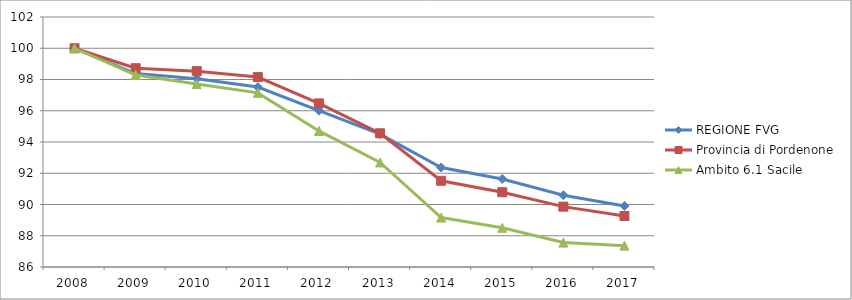
| Category | REGIONE FVG | Provincia di Pordenone | Ambito 6.1 Sacile |
|---|---|---|---|
| 2008.0 | 100 | 100 | 100 |
| 2009.0 | 98.378 | 98.723 | 98.291 |
| 2010.0 | 98.049 | 98.535 | 97.709 |
| 2011.0 | 97.515 | 98.157 | 97.145 |
| 2012.0 | 96.012 | 96.472 | 94.709 |
| 2013.0 | 94.5 | 94.558 | 92.691 |
| 2014.0 | 92.37 | 91.517 | 89.164 |
| 2015.0 | 91.632 | 90.784 | 88.509 |
| 2016.0 | 90.595 | 89.863 | 87.564 |
| 2017.0 | 89.908 | 89.262 | 87.364 |